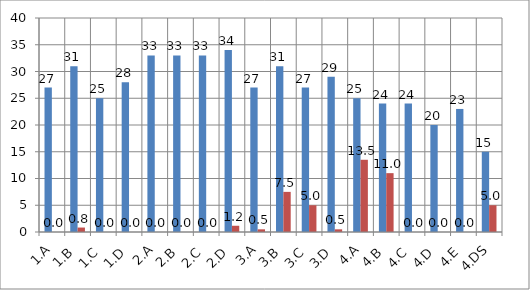
| Category | Series 0 | Series 1 |
|---|---|---|
| 1.A | 27 | 0 |
| 1.B | 31 | 0.833 |
| 1.C | 25 | 0 |
| 1.D | 28 | 0 |
| 2.A | 33 | 0 |
| 2.B | 33 | 0 |
| 2.C | 33 | 0 |
| 2.D | 34 | 1.167 |
| 3.A | 27 | 0.5 |
| 3.B | 31 | 7.5 |
| 3.C | 27 | 5 |
| 3.D | 29 | 0.5 |
| 4.A | 25 | 13.5 |
| 4.B | 24 | 11 |
| 4.C | 24 | 0 |
| 4.D | 20 | 0 |
| 4.E | 23 | 0 |
| 4.DS | 15 | 5 |